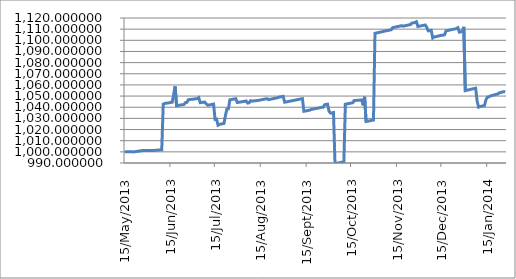
| Category | Series 0 |
|---|---|
| 2013-05-15 | 1000 |
| 2013-05-16 | 1000 |
| 2013-05-17 | 1000 |
| 2013-05-18 | 1000 |
| 2013-05-19 | 1000 |
| 2013-05-20 | 1000 |
| 2013-05-21 | 999.946 |
| 2013-05-22 | 1000.15 |
| 2013-05-23 | 1000.354 |
| 2013-05-24 | 1000.556 |
| 2013-05-25 | 1000.758 |
| 2013-05-26 | 1000.96 |
| 2013-05-27 | 1001.162 |
| 2013-05-28 | 1001.181 |
| 2013-05-29 | 1001.2 |
| 2013-05-30 | 1001.219 |
| 2013-05-31 | 1001.236 |
| 2013-06-01 | 1001.254 |
| 2013-06-02 | 1001.272 |
| 2013-06-03 | 1001.282 |
| 2013-06-04 | 1001.274 |
| 2013-06-05 | 1001.4 |
| 2013-06-06 | 1001.526 |
| 2013-06-07 | 1001.65 |
| 2013-06-08 | 1001.774 |
| 2013-06-09 | 1001.897 |
| 2013-06-10 | 1042.798 |
| 2013-06-11 | 1043.381 |
| 2013-06-12 | 1043.592 |
| 2013-06-13 | 1043.803 |
| 2013-06-14 | 1044.014 |
| 2013-06-15 | 1044.228 |
| 2013-06-16 | 1044.443 |
| 2013-06-17 | 1050.972 |
| 2013-06-18 | 1058.784 |
| 2013-06-19 | 1041.396 |
| 2013-06-20 | 1041.61 |
| 2013-06-21 | 1041.825 |
| 2013-06-22 | 1042.039 |
| 2013-06-23 | 1042.254 |
| 2013-06-24 | 1042.468 |
| 2013-06-25 | 1044.16 |
| 2013-06-26 | 1044.375 |
| 2013-06-27 | 1046.772 |
| 2013-06-28 | 1046.927 |
| 2013-06-29 | 1047.082 |
| 2013-06-30 | 1047.236 |
| 2013-07-01 | 1047.391 |
| 2013-07-02 | 1047.545 |
| 2013-07-03 | 1047.753 |
| 2013-07-04 | 1048.59 |
| 2013-07-05 | 1044.061 |
| 2013-07-06 | 1044.259 |
| 2013-07-07 | 1044.458 |
| 2013-07-08 | 1044.656 |
| 2013-07-09 | 1043.075 |
| 2013-07-10 | 1041.779 |
| 2013-07-11 | 1042.037 |
| 2013-07-12 | 1042.295 |
| 2013-07-13 | 1042.553 |
| 2013-07-14 | 1042.812 |
| 2013-07-15 | 1029.086 |
| 2013-07-16 | 1029.344 |
| 2013-07-17 | 1023.86 |
| 2013-07-18 | 1024.655 |
| 2013-07-19 | 1024.913 |
| 2013-07-20 | 1025.171 |
| 2013-07-21 | 1025.43 |
| 2013-07-22 | 1032.513 |
| 2013-07-23 | 1038.32 |
| 2013-07-24 | 1038.578 |
| 2013-07-25 | 1046.624 |
| 2013-07-26 | 1046.881 |
| 2013-07-27 | 1047.138 |
| 2013-07-28 | 1047.395 |
| 2013-07-29 | 1047.652 |
| 2013-07-30 | 1044.241 |
| 2013-07-31 | 1044.46 |
| 2013-08-01 | 1044.679 |
| 2013-08-02 | 1044.898 |
| 2013-08-03 | 1045.117 |
| 2013-08-04 | 1045.336 |
| 2013-08-05 | 1045.592 |
| 2013-08-06 | 1043.723 |
| 2013-08-07 | 1043.979 |
| 2013-08-08 | 1045.869 |
| 2013-08-09 | 1045.39 |
| 2013-08-10 | 1045.63 |
| 2013-08-11 | 1045.871 |
| 2013-08-12 | 1045.919 |
| 2013-08-13 | 1046.09 |
| 2013-08-14 | 1046.355 |
| 2013-08-15 | 1046.621 |
| 2013-08-16 | 1046.887 |
| 2013-08-17 | 1047.153 |
| 2013-08-18 | 1047.418 |
| 2013-08-19 | 1047.684 |
| 2013-08-20 | 1046.806 |
| 2013-08-21 | 1047.071 |
| 2013-08-22 | 1047.337 |
| 2013-08-23 | 1047.602 |
| 2013-08-24 | 1047.868 |
| 2013-08-25 | 1048.133 |
| 2013-08-26 | 1048.399 |
| 2013-08-27 | 1048.999 |
| 2013-08-28 | 1049.264 |
| 2013-08-29 | 1049.53 |
| 2013-08-30 | 1049.795 |
| 2013-08-31 | 1044.505 |
| 2013-09-01 | 1044.771 |
| 2013-09-02 | 1045.037 |
| 2013-09-03 | 1045.302 |
| 2013-09-04 | 1045.563 |
| 2013-09-05 | 1045.828 |
| 2013-09-06 | 1046.093 |
| 2013-09-07 | 1046.358 |
| 2013-09-08 | 1046.623 |
| 2013-09-09 | 1046.888 |
| 2013-09-10 | 1047.154 |
| 2013-09-11 | 1047.411 |
| 2013-09-12 | 1047.669 |
| 2013-09-13 | 1036.355 |
| 2013-09-14 | 1036.613 |
| 2013-09-15 | 1036.872 |
| 2013-09-16 | 1037.132 |
| 2013-09-17 | 1037.392 |
| 2013-09-18 | 1038.002 |
| 2013-09-19 | 1038.269 |
| 2013-09-20 | 1038.538 |
| 2013-09-21 | 1038.807 |
| 2013-09-22 | 1039.075 |
| 2013-09-23 | 1039.347 |
| 2013-09-24 | 1039.618 |
| 2013-09-25 | 1039.89 |
| 2013-09-26 | 1040.03 |
| 2013-09-27 | 1042.237 |
| 2013-09-28 | 1042.501 |
| 2013-09-29 | 1042.765 |
| 2013-09-30 | 1036.245 |
| 2013-10-01 | 1034.714 |
| 2013-10-02 | 1034.98 |
| 2013-10-03 | 1035.25 |
| 2013-10-04 | 989.42 |
| 2013-10-05 | 989.692 |
| 2013-10-06 | 989.964 |
| 2013-10-07 | 990.236 |
| 2013-10-08 | 990.508 |
| 2013-10-09 | 990.78 |
| 2013-10-10 | 991.052 |
| 2013-10-11 | 1042.667 |
| 2013-10-12 | 1042.936 |
| 2013-10-13 | 1043.205 |
| 2013-10-14 | 1043.474 |
| 2013-10-15 | 1043.742 |
| 2013-10-16 | 1044.011 |
| 2013-10-17 | 1045.998 |
| 2013-10-18 | 1046.097 |
| 2013-10-19 | 1046.195 |
| 2013-10-20 | 1046.293 |
| 2013-10-21 | 1046.392 |
| 2013-10-22 | 1046.49 |
| 2013-10-23 | 1041.74 |
| 2013-10-24 | 1049.365 |
| 2013-10-25 | 1027.211 |
| 2013-10-26 | 1027.466 |
| 2013-10-27 | 1027.721 |
| 2013-10-28 | 1027.975 |
| 2013-10-29 | 1028.232 |
| 2013-10-30 | 1028.489 |
| 2013-10-31 | 1106.27 |
| 2013-11-01 | 1106.559 |
| 2013-11-02 | 1106.848 |
| 2013-11-03 | 1107.137 |
| 2013-11-04 | 1107.426 |
| 2013-11-05 | 1107.714 |
| 2013-11-06 | 1108.095 |
| 2013-11-07 | 1108.384 |
| 2013-11-08 | 1108.602 |
| 2013-11-09 | 1108.892 |
| 2013-11-10 | 1109.181 |
| 2013-11-11 | 1109.471 |
| 2013-11-12 | 1111.367 |
| 2013-11-13 | 1111.656 |
| 2013-11-14 | 1111.945 |
| 2013-11-15 | 1112.235 |
| 2013-11-16 | 1112.524 |
| 2013-11-17 | 1112.813 |
| 2013-11-18 | 1113.102 |
| 2013-11-19 | 1112.688 |
| 2013-11-20 | 1112.977 |
| 2013-11-21 | 1113.266 |
| 2013-11-22 | 1113.556 |
| 2013-11-23 | 1113.845 |
| 2013-11-24 | 1114.134 |
| 2013-11-25 | 1115.402 |
| 2013-11-26 | 1115.691 |
| 2013-11-27 | 1115.979 |
| 2013-11-28 | 1116.658 |
| 2013-11-29 | 1112.388 |
| 2013-11-30 | 1112.659 |
| 2013-12-01 | 1112.93 |
| 2013-12-02 | 1113.201 |
| 2013-12-03 | 1113.473 |
| 2013-12-04 | 1113.744 |
| 2013-12-05 | 1111.508 |
| 2013-12-06 | 1108.428 |
| 2013-12-07 | 1108.704 |
| 2013-12-08 | 1108.98 |
| 2013-12-09 | 1102.103 |
| 2013-12-10 | 1102.98 |
| 2013-12-11 | 1103.277 |
| 2013-12-12 | 1103.51 |
| 2013-12-13 | 1103.946 |
| 2013-12-14 | 1104.243 |
| 2013-12-15 | 1104.54 |
| 2013-12-16 | 1104.621 |
| 2013-12-17 | 1104.918 |
| 2013-12-18 | 1108.465 |
| 2013-12-19 | 1108.761 |
| 2013-12-20 | 1109.057 |
| 2013-12-21 | 1109.353 |
| 2013-12-22 | 1109.649 |
| 2013-12-23 | 1109.945 |
| 2013-12-24 | 1110.191 |
| 2013-12-25 | 1110.487 |
| 2013-12-26 | 1111.313 |
| 2013-12-27 | 1107.313 |
| 2013-12-28 | 1107.607 |
| 2013-12-29 | 1107.9 |
| 2013-12-30 | 1112.055 |
| 2013-12-31 | 1054.865 |
| 2014-01-01 | 1055.184 |
| 2014-01-02 | 1055.504 |
| 2014-01-03 | 1055.816 |
| 2014-01-04 | 1056.135 |
| 2014-01-05 | 1056.454 |
| 2014-01-06 | 1056.772 |
| 2014-01-07 | 1057.056 |
| 2014-01-08 | 1045.467 |
| 2014-01-09 | 1040.077 |
| 2014-01-10 | 1040.558 |
| 2014-01-11 | 1040.897 |
| 2014-01-12 | 1041.236 |
| 2014-01-13 | 1041.576 |
| 2014-01-14 | 1046.907 |
| 2014-01-15 | 1049.065 |
| 2014-01-16 | 1049.404 |
| 2014-01-17 | 1050.165 |
| 2014-01-18 | 1050.517 |
| 2014-01-19 | 1050.87 |
| 2014-01-20 | 1051.223 |
| 2014-01-21 | 1051.575 |
| 2014-01-22 | 1051.928 |
| 2014-01-23 | 1052.904 |
| 2014-01-24 | 1053.256 |
| 2014-01-25 | 1053.609 |
| 2014-01-26 | 1053.961 |
| 2014-01-27 | 1053.777 |